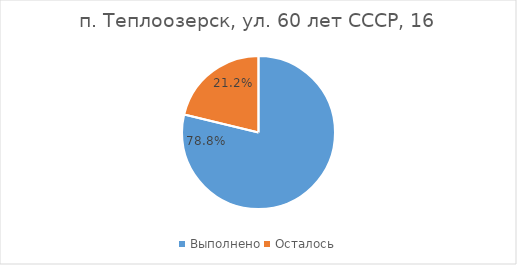
| Category | п. Теплоозерск, ул. 60 лет СССР, 16 |
|---|---|
| Выполнено | 0.788 |
| Осталось | 0.212 |